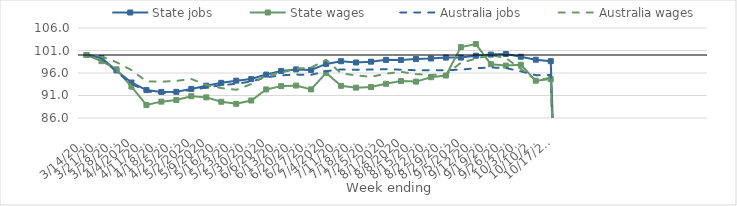
| Category | State jobs | State wages | Australia jobs | Australia wages |
|---|---|---|---|---|
| 14/03/2020 | 100 | 100 | 100 | 100 |
| 21/03/2020 | 99.343 | 98.63 | 99.265 | 99.682 |
| 28/03/2020 | 96.564 | 96.824 | 96.284 | 98.406 |
| 04/04/2020 | 93.886 | 92.966 | 93.626 | 96.656 |
| 11/04/2020 | 92.207 | 88.904 | 91.924 | 94.154 |
| 18/04/2020 | 91.797 | 89.637 | 91.482 | 94.062 |
| 25/04/2020 | 91.81 | 90.003 | 91.821 | 94.245 |
| 02/05/2020 | 92.459 | 90.844 | 92.221 | 94.677 |
| 09/05/2020 | 93.185 | 90.584 | 92.772 | 93.304 |
| 16/05/2020 | 93.814 | 89.613 | 93.305 | 92.652 |
| 23/05/2020 | 94.295 | 89.15 | 93.609 | 92.272 |
| 30/05/2020 | 94.65 | 89.89 | 94.11 | 93.544 |
| 06/06/2020 | 95.651 | 92.35 | 95.034 | 95.442 |
| 13/06/2020 | 96.454 | 93.083 | 95.487 | 96.076 |
| 20/06/2020 | 96.796 | 93.209 | 95.645 | 96.966 |
| 27/06/2020 | 96.678 | 92.364 | 95.594 | 97.186 |
| 04/07/2020 | 98.016 | 96.027 | 96.409 | 98.934 |
| 11/07/2020 | 98.623 | 93.147 | 96.784 | 95.92 |
| 18/07/2020 | 98.334 | 92.748 | 96.696 | 95.473 |
| 25/07/2020 | 98.516 | 92.879 | 96.767 | 95.143 |
| 01/08/2020 | 98.919 | 93.599 | 96.854 | 95.856 |
| 08/08/2020 | 98.899 | 94.218 | 96.728 | 96.257 |
| 15/08/2020 | 99.118 | 94.086 | 96.62 | 95.754 |
| 22/08/2020 | 99.218 | 95.066 | 96.624 | 95.563 |
| 29/08/2020 | 99.423 | 95.437 | 96.609 | 95.684 |
| 05/09/2020 | 99.433 | 101.748 | 96.751 | 98.286 |
| 12/09/2020 | 99.844 | 102.434 | 97.054 | 99.176 |
| 19/09/2020 | 100.089 | 97.955 | 97.226 | 99.992 |
| 26/09/2020 | 100.223 | 97.644 | 97.1 | 99.309 |
| 03/10/2020 | 99.617 | 97.836 | 96.368 | 96.936 |
| 10/10/2020 | 98.955 | 94.288 | 95.514 | 94.424 |
| 17/10/2020 | 98.629 | 94.644 | 95.573 | 94.889 |